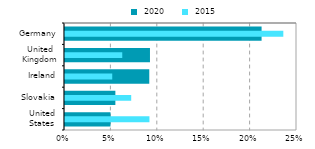
| Category |  2020 |
|---|---|
| United
States | 0.049 |
| Slovakia | 0.054 |
| Ireland | 0.091 |
| United
Kingdom | 0.092 |
| Germany | 0.212 |